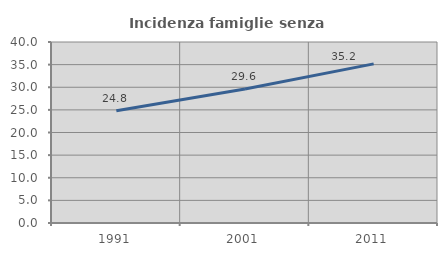
| Category | Incidenza famiglie senza nuclei |
|---|---|
| 1991.0 | 24.804 |
| 2001.0 | 29.596 |
| 2011.0 | 35.16 |